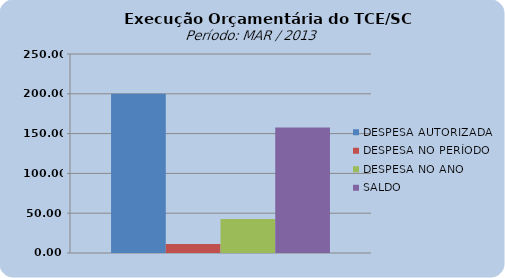
| Category | DESPESA AUTORIZADA | DESPESA NO PERÍODO | DESPESA NO ANO | SALDO |
|---|---|---|---|---|
| 0 | 200105815.88 | 11423125.68 | 42578987.89 | 157526827.99 |